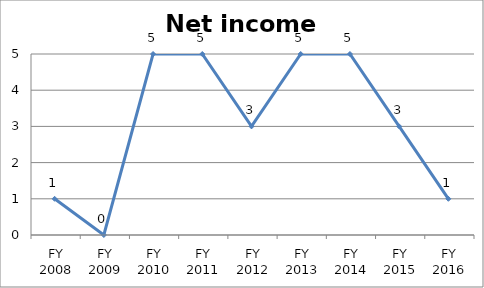
| Category | Net income score |
|---|---|
| FY 2016 | 1 |
| FY 2015 | 3 |
| FY 2014 | 5 |
| FY 2013 | 5 |
| FY 2012 | 3 |
| FY 2011 | 5 |
| FY 2010 | 5 |
| FY 2009 | 0 |
| FY 2008 | 1 |